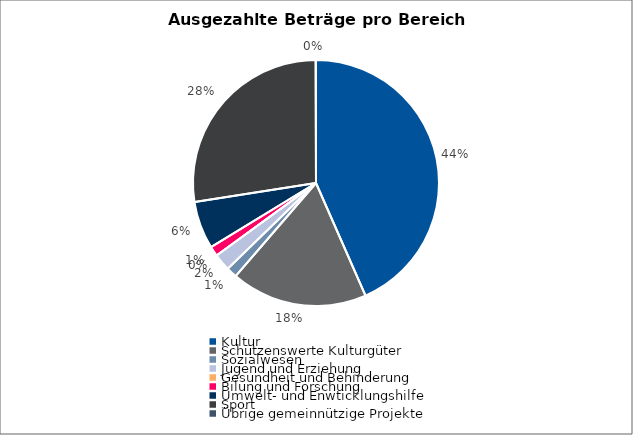
| Category | Series 0 |
|---|---|
| Kultur | 4759315 |
| Schützenswerte Kulturgüter | 1964872 |
| Sozialwesen | 154000 |
| Jugend und Erziehung | 245384.25 |
| Gesundheit und Behinderung | 0 |
| Bilung und Forschung | 142500 |
| Umwelt- und Enwticklungshilfe | 685235.15 |
| Sport | 3007606 |
| Übrige gemeinnützige Projekte | 5000 |